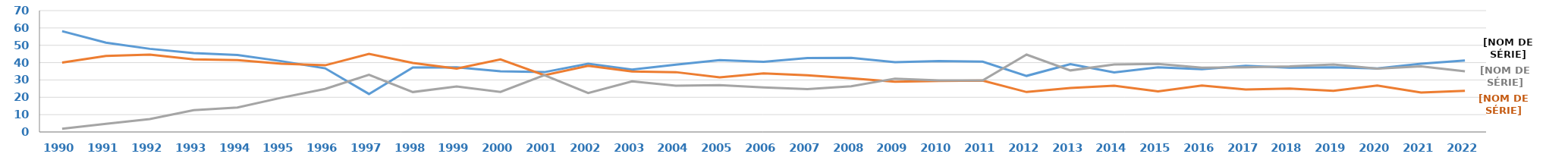
| Category | Bac. Général | Bac. Technologique | Bac. Professionnel |
|---|---|---|---|
| 1990.0 | 58.129 | 40.031 | 1.84 |
| 1991.0 | 51.507 | 43.836 | 4.658 |
| 1992.0 | 47.958 | 44.574 | 7.468 |
| 1993.0 | 45.473 | 41.935 | 12.591 |
| 1994.0 | 44.424 | 41.425 | 14.152 |
| 1995.0 | 40.851 | 39.402 | 19.746 |
| 1996.0 | 36.719 | 38.455 | 24.826 |
| 1997.0 | 21.914 | 45.062 | 33.025 |
| 1998.0 | 37.186 | 39.782 | 23.032 |
| 1999.0 | 37.256 | 36.534 | 26.209 |
| 2000.0 | 35.007 | 41.867 | 23.126 |
| 2001.0 | 34.515 | 32.709 | 32.776 |
| 2002.0 | 39.396 | 38.152 | 22.453 |
| 2003.0 | 35.939 | 34.871 | 29.19 |
| 2004.0 | 38.805 | 34.506 | 26.689 |
| 2005.0 | 41.425 | 31.507 | 27.068 |
| 2006.0 | 40.466 | 33.782 | 25.751 |
| 2007.0 | 42.636 | 32.669 | 24.695 |
| 2008.0 | 42.72 | 30.94 | 26.34 |
| 2009.0 | 40.241 | 28.975 | 30.783 |
| 2010.0 | 40.875 | 29.376 | 29.749 |
| 2011.0 | 40.568 | 29.649 | 29.783 |
| 2012.0 | 32.343 | 23.041 | 44.615 |
| 2013.0 | 39.152 | 25.346 | 35.501 |
| 2014.0 | 34.334 | 26.704 | 38.961 |
| 2015.0 | 37.323 | 23.453 | 39.224 |
| 2016.0 | 36.166 | 26.797 | 37.037 |
| 2017.0 | 38.214 | 24.461 | 37.325 |
| 2018.0 | 37.084 | 25.088 | 37.827 |
| 2019.0 | 37.308 | 23.71 | 38.982 |
| 2020.0 | 36.606 | 26.822 | 36.572 |
| 2021.0 | 39.423 | 22.762 | 37.816 |
| 2022.0 | 41.265 | 23.722 | 35.013 |